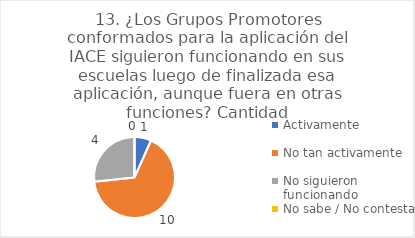
| Category | 13. ¿Los Grupos Promotores conformados para la aplicación del IACE siguieron funcionando en sus escuelas luego de finalizada esa aplicación, aunque fuera en otras funciones? |
|---|---|
| Activamente  | 0.067 |
| No tan activamente  | 0.667 |
| No siguieron funcionando  | 0.267 |
| No sabe / No contesta | 0 |